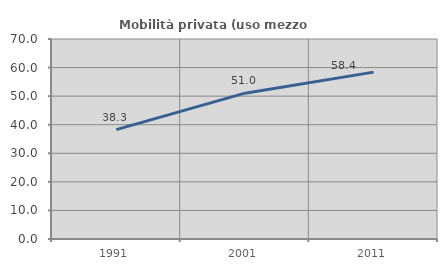
| Category | Mobilità privata (uso mezzo privato) |
|---|---|
| 1991.0 | 38.281 |
| 2001.0 | 51.041 |
| 2011.0 | 58.41 |